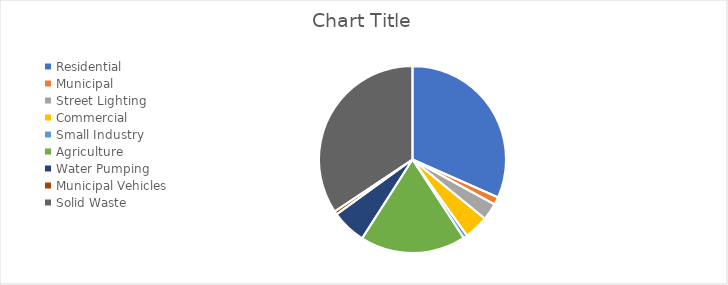
| Category | Series 0 |
|---|---|
| Residential | 10.5 |
| Municipal  | 0.44 |
| Street Lighting | 0.98 |
| Commercial | 1.39 |
| Small Industry | 0.23 |
| Agriculture | 6.06 |
| Water Pumping | 1.99 |
| Municipal Vehicles | 0.194 |
| Solid Waste  | 11.41 |